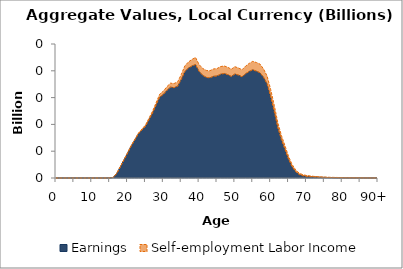
| Category | Earnings | Self-employment Labor Income |
|---|---|---|
| 0 | 0 | 0 |
|  | 0 | 0 |
| 2 | 0 | 0 |
| 3 | 0 | 0 |
| 4 | 0 | 0 |
| 5 | 0 | 0 |
| 6 | 0 | 0 |
| 7 | 0 | 0 |
| 8 | 0 | 0 |
| 9 | 0 | 0 |
| 10 | 0 | 0 |
| 11 | 0 | 0 |
| 12 | 0 | 0 |
| 13 | 0 | 0 |
| 14 | 0 | 0 |
| 15 | 0 | 0 |
| 16 | 0.236 | 0.001 |
| 17 | 1.772 | 0.009 |
| 18 | 4.244 | 0.022 |
| 19 | 6.772 | 0.044 |
| 20 | 9.292 | 0.076 |
| 21 | 11.925 | 0.13 |
| 22 | 14.138 | 0.199 |
| 23 | 16.408 | 0.281 |
| 24 | 17.894 | 0.36 |
| 25 | 19.291 | 0.439 |
| 26 | 21.763 | 0.565 |
| 27 | 24.253 | 0.718 |
| 28 | 27.249 | 0.891 |
| 29 | 30.215 | 1.076 |
| 30 | 31.187 | 1.215 |
| 31 | 32.712 | 1.37 |
| 32 | 33.899 | 1.485 |
| 33 | 33.714 | 1.533 |
| 34 | 34.246 | 1.62 |
| 35 | 36.754 | 1.827 |
| 36 | 39.716 | 2.079 |
| 37 | 41.003 | 2.268 |
| 38 | 41.788 | 2.458 |
| 39 | 42.332 | 2.642 |
| 40 | 39.745 | 2.581 |
| 41 | 38.329 | 2.555 |
| 42 | 37.543 | 2.594 |
| 43 | 37.347 | 2.666 |
| 44 | 37.942 | 2.741 |
| 45 | 38.059 | 2.765 |
| 46 | 38.722 | 2.839 |
| 47 | 38.984 | 2.825 |
| 48 | 38.565 | 2.752 |
| 49 | 37.882 | 2.695 |
| 50 | 38.804 | 2.722 |
| 51 | 38.403 | 2.646 |
| 52 | 37.763 | 2.641 |
| 53 | 38.907 | 2.838 |
| 54 | 39.767 | 2.995 |
| 55 | 40.38 | 3.148 |
| 56 | 39.862 | 3.235 |
| 57 | 39.286 | 3.237 |
| 58 | 37.623 | 3.087 |
| 59 | 35.098 | 2.953 |
| 60 | 30.341 | 2.699 |
| 61 | 24.809 | 2.328 |
| 62 | 18.752 | 1.892 |
| 63 | 14.298 | 1.609 |
| 64 | 10.675 | 1.376 |
| 65 | 6.998 | 1.071 |
| 66 | 4.179 | 0.84 |
| 67 | 2.341 | 0.678 |
| 68 | 1.277 | 0.521 |
| 69 | 0.821 | 0.412 |
| 70 | 0.614 | 0.33 |
| 71 | 0.508 | 0.263 |
| 72 | 0.41 | 0.197 |
| 73 | 0.342 | 0.163 |
| 74 | 0.274 | 0.135 |
| 75 | 0.232 | 0.119 |
| 76 | 0.183 | 0.098 |
| 77 | 0.148 | 0.093 |
| 78 | 0.121 | 0.097 |
| 79 | 0.093 | 0.09 |
| 80 | 0.068 | 0.081 |
| 81 | 0.049 | 0.074 |
| 82 | 0.044 | 0.067 |
| 83 | 0.041 | 0.057 |
| 84 | 0.028 | 0.042 |
| 85 | 0.024 | 0.035 |
| 86 | 0.021 | 0.027 |
| 87 | 0.015 | 0.023 |
| 88 | 0.01 | 0.018 |
| 89 | 0.007 | 0.014 |
| 90+ | 0.01 | 0.015 |